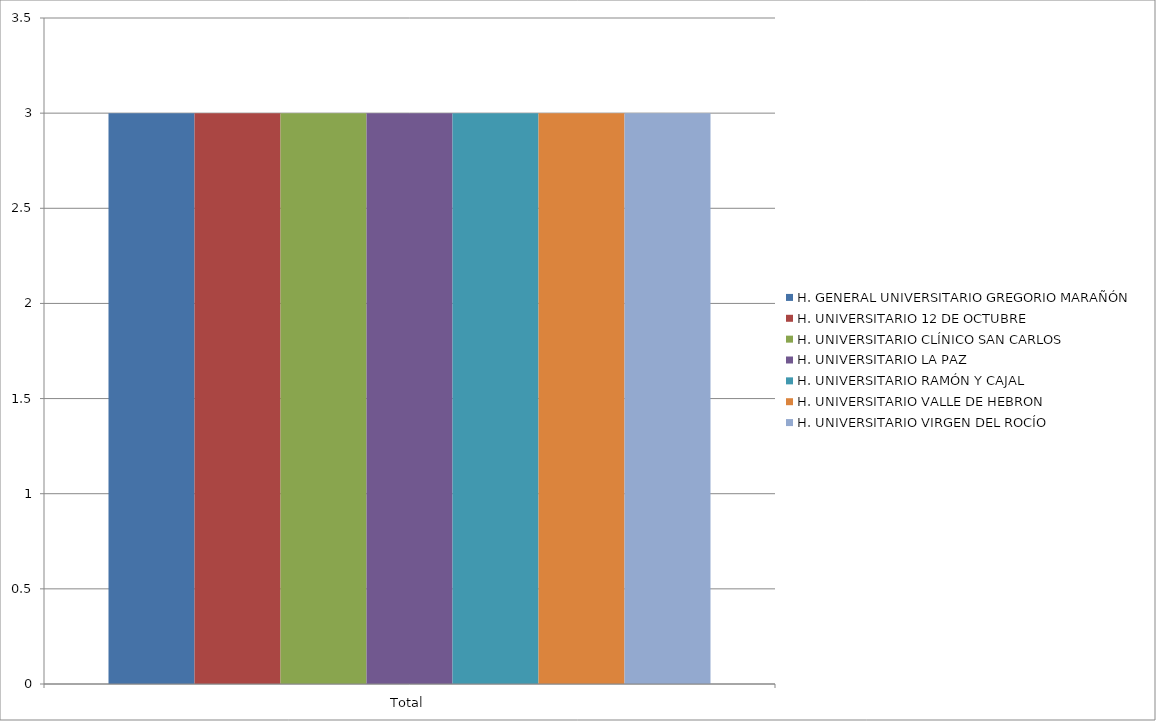
| Category | H. GENERAL UNIVERSITARIO GREGORIO MARAÑÓN | H. UNIVERSITARIO 12 DE OCTUBRE | H. UNIVERSITARIO CLÍNICO SAN CARLOS | H. UNIVERSITARIO LA PAZ | H. UNIVERSITARIO RAMÓN Y CAJAL | H. UNIVERSITARIO VALLE DE HEBRON | H. UNIVERSITARIO VIRGEN DEL ROCÍO |
|---|---|---|---|---|---|---|---|
| Total | 3 | 3 | 3 | 3 | 3 | 3 | 3 |